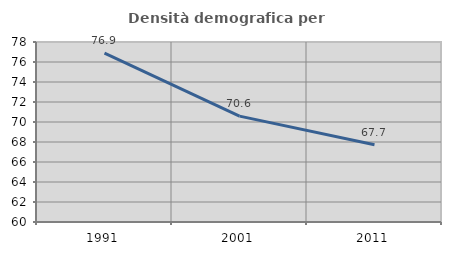
| Category | Densità demografica |
|---|---|
| 1991.0 | 76.882 |
| 2001.0 | 70.585 |
| 2011.0 | 67.734 |